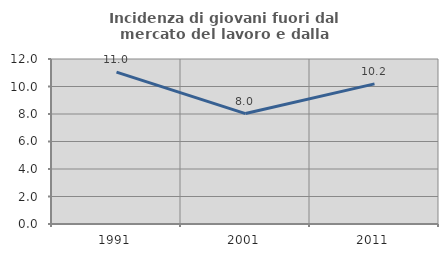
| Category | Incidenza di giovani fuori dal mercato del lavoro e dalla formazione  |
|---|---|
| 1991.0 | 11.044 |
| 2001.0 | 8.032 |
| 2011.0 | 10.193 |